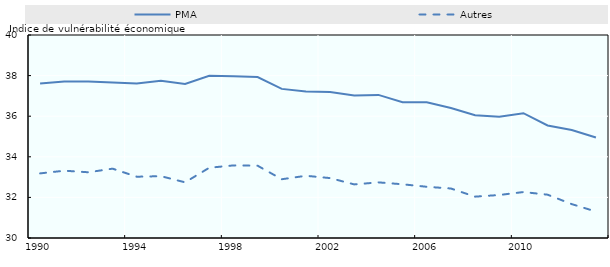
| Category | PMA | Autres |
|---|---|---|
| 1990.0 | 37.616 | 33.183 |
| 1991.0 | 37.715 | 33.315 |
| 1992.0 | 37.714 | 33.238 |
| 1993.0 | 37.656 | 33.416 |
| 1994.0 | 37.614 | 33.019 |
| 1995.0 | 37.742 | 33.045 |
| 1996.0 | 37.586 | 32.743 |
| 1997.0 | 37.993 | 33.46 |
| 1998.0 | 37.965 | 33.576 |
| 1999.0 | 37.925 | 33.562 |
| 2000.0 | 37.345 | 32.895 |
| 2001.0 | 37.222 | 33.065 |
| 2002.0 | 37.188 | 32.951 |
| 2003.0 | 37.022 | 32.64 |
| 2004.0 | 37.049 | 32.74 |
| 2005.0 | 36.687 | 32.646 |
| 2006.0 | 36.684 | 32.523 |
| 2007.0 | 36.407 | 32.438 |
| 2008.0 | 36.05 | 32.037 |
| 2009.0 | 35.975 | 32.118 |
| 2010.0 | 36.149 | 32.264 |
| 2011.0 | 35.543 | 32.134 |
| 2012.0 | 35.32 | 31.669 |
| 2013.0 | 34.952 | 31.303 |